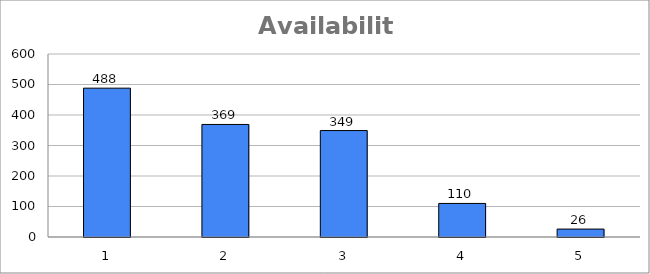
| Category | Series 0 |
|---|---|
| 0 | 488 |
| 1 | 369 |
| 2 | 349 |
| 3 | 110 |
| 4 | 26 |